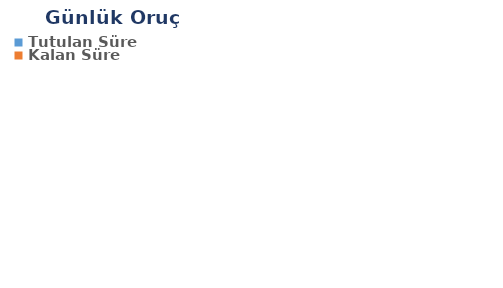
| Category | Günlük |
|---|---|
| Tutulan Süre | 0 |
| Kalan Süre | 0 |